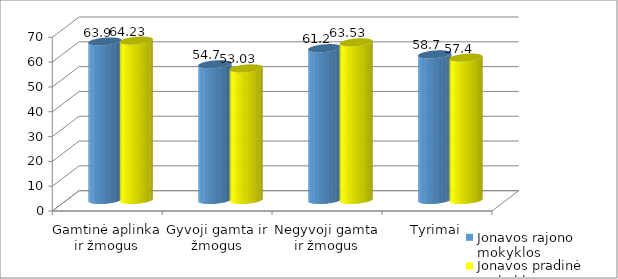
| Category | Jonavos rajono mokyklos | Jonavos pradinė mokykla |
|---|---|---|
| Gamtinė aplinka ir žmogus | 63.9 | 64.23 |
| Gyvoji gamta ir žmogus | 54.7 | 53.03 |
| Negyvoji gamta ir žmogus | 61.2 | 63.53 |
| Tyrimai | 58.7 | 57.4 |